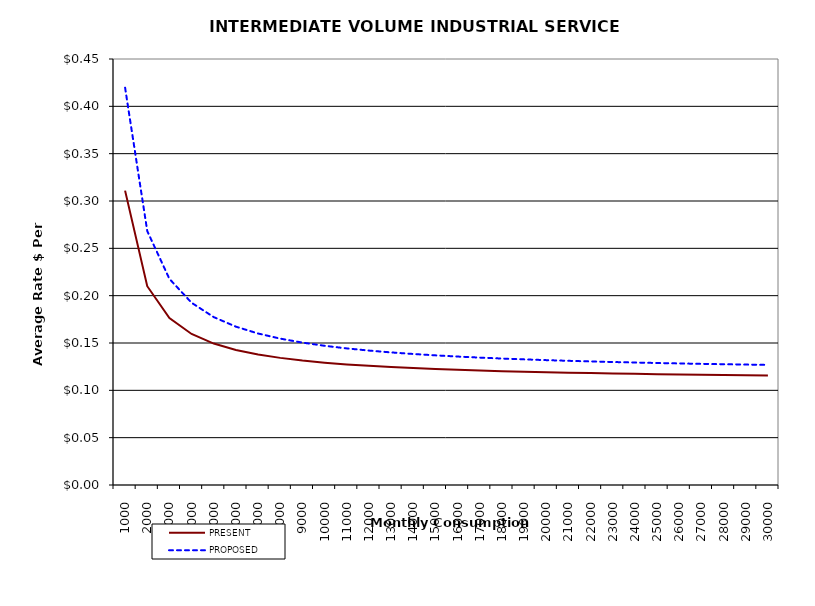
| Category | PRESENT | PROPOSED |
|---|---|---|
| 1000.0 | 0.311 | 0.42 |
| 2000.0 | 0.21 | 0.268 |
| 3000.0 | 0.176 | 0.218 |
| 4000.0 | 0.16 | 0.192 |
| 5000.0 | 0.149 | 0.177 |
| 6000.0 | 0.143 | 0.167 |
| 7000.0 | 0.138 | 0.16 |
| 8000.0 | 0.134 | 0.155 |
| 9000.0 | 0.131 | 0.15 |
| 10000.0 | 0.129 | 0.147 |
| 11000.0 | 0.127 | 0.144 |
| 12000.0 | 0.126 | 0.142 |
| 13000.0 | 0.125 | 0.14 |
| 14000.0 | 0.123 | 0.138 |
| 15000.0 | 0.123 | 0.137 |
| 16000.0 | 0.122 | 0.136 |
| 17000.0 | 0.121 | 0.135 |
| 18000.0 | 0.12 | 0.134 |
| 19000.0 | 0.12 | 0.133 |
| 20000.0 | 0.119 | 0.132 |
| 21000.0 | 0.119 | 0.131 |
| 22000.0 | 0.118 | 0.131 |
| 23000.0 | 0.118 | 0.13 |
| 24000.0 | 0.117 | 0.129 |
| 25000.0 | 0.117 | 0.129 |
| 26000.0 | 0.117 | 0.128 |
| 27000.0 | 0.117 | 0.128 |
| 28000.0 | 0.116 | 0.128 |
| 29000.0 | 0.116 | 0.127 |
| 30000.0 | 0.116 | 0.127 |